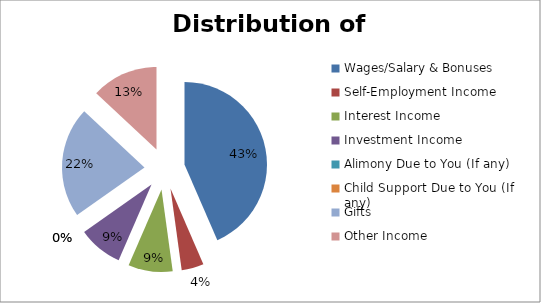
| Category | Series 0 |
|---|---|
| Wages/Salary & Bonuses | 1000 |
| Self-Employment Income | 100 |
| Interest Income | 200 |
| Investment Income | 200 |
| Alimony Due to You (If any) | 0 |
| Child Support Due to You (If any) | 0 |
| Gifts | 500 |
| Other Income | 300 |